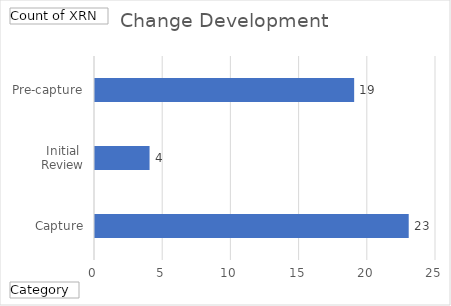
| Category | Total |
|---|---|
| Capture | 23 |
| Initial Review | 4 |
| Pre-capture | 19 |